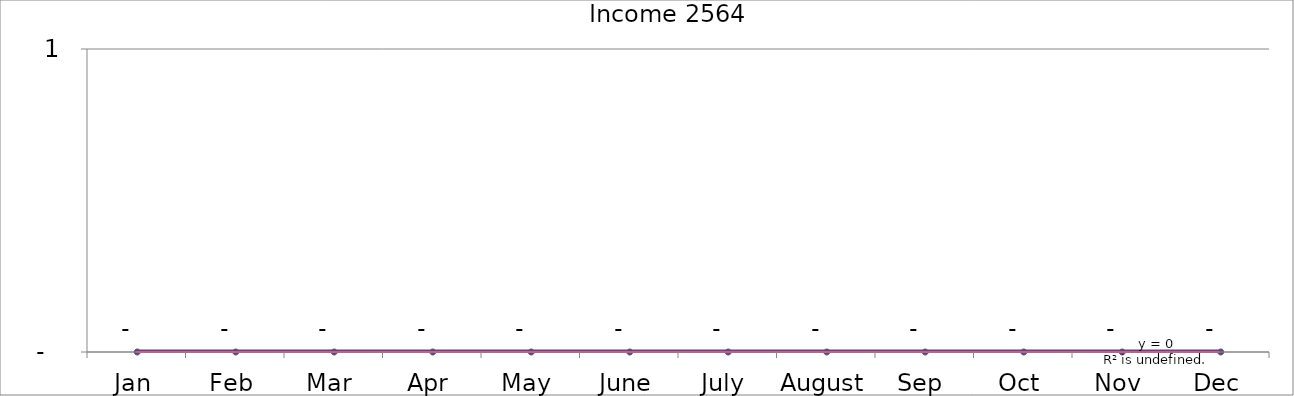
| Category | Series1 |
|---|---|
| Jan | 0 |
| Feb | 0 |
| Mar | 0 |
| Apr | 0 |
| May | 0 |
| June | 0 |
| July | 0 |
| August | 0 |
| Sep | 0 |
| Oct | 0 |
| Nov | 0 |
| Dec | 0 |